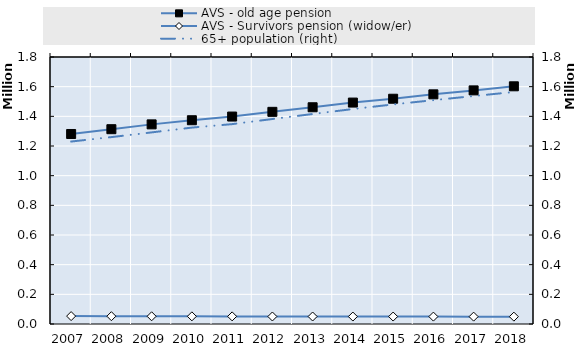
| Category | AVS - old age pension | AVS - Survivors pension (widow/er) | Survivors' pension from occupational accident insurance | 0 | Series 14 | Series 15 | Series 16 | Series 17 | Series 18 | Series 19 |
|---|---|---|---|---|---|---|---|---|---|---|
| 2007.0 | 1280921 | 53198 |  |  |  |  |  |  |  |  |
| 2008.0 | 1313253 | 52607 |  |  |  |  |  |  |  |  |
| 2009.0 | 1345817 | 51997 |  |  |  |  |  |  |  |  |
| 2010.0 | 1373743 | 51545 |  |  |  |  |  |  |  |  |
| 2011.0 | 1398508 | 51314 |  |  |  |  |  |  |  |  |
| 2012.0 | 1430350 | 50588 |  |  |  |  |  |  |  |  |
| 2013.0 | 1461211 | 50457 |  |  |  |  |  |  |  |  |
| 2014.0 | 1492747 | 50199 |  |  |  |  |  |  |  |  |
| 2015.0 | 1518578 | 50192 |  |  |  |  |  |  |  |  |
| 2016.0 | 1548316 | 49918 |  |  |  |  |  |  |  |  |
| 2017.0 | 1574955 | 49704 |  |  |  |  |  |  |  |  |
| 2018.0 | 1602415 | 49534 |  |  |  |  |  |  |  |  |